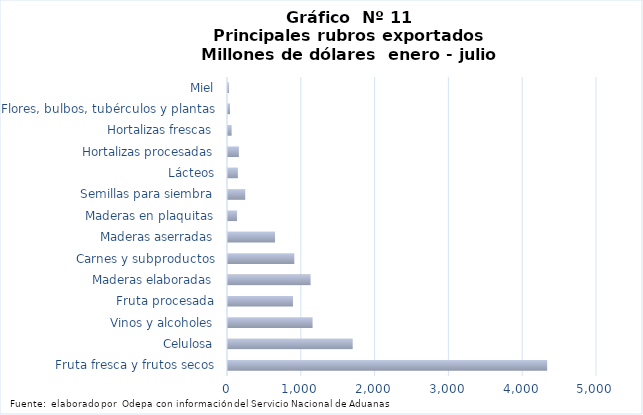
| Category | Series 7 |
|---|---|
| Fruta fresca y frutos secos | 4324857.181 |
| Celulosa | 1689698.09 |
| Vinos y alcoholes | 1145932.646 |
| Fruta procesada | 880341.928 |
| Maderas elaboradas | 1119173.078 |
| Carnes y subproductos | 898620.485 |
| Maderas aserradas | 637035.32 |
| Maderas en plaquitas | 122226.041 |
| Semillas para siembra | 233659.706 |
| Lácteos | 133624.498 |
| Hortalizas procesadas | 147316.901 |
| Hortalizas frescas | 49140.529 |
| Flores, bulbos, tubérculos y plantas | 26883.685 |
| Miel | 12189.886 |